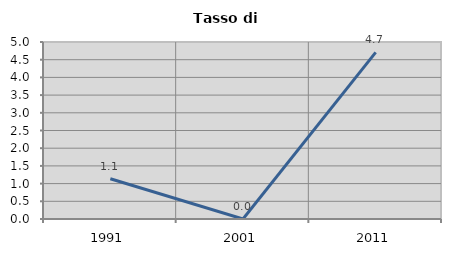
| Category | Tasso di disoccupazione   |
|---|---|
| 1991.0 | 1.136 |
| 2001.0 | 0 |
| 2011.0 | 4.706 |